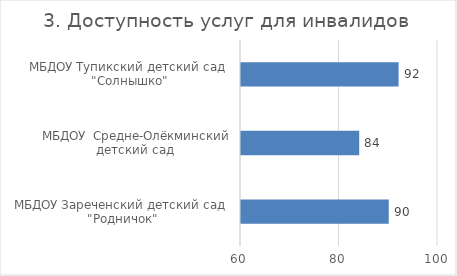
| Category | 3. Доступность услуг для инвалидов |
|---|---|
| МБДОУ Зареченский детский сад  "Родничок" | 90 |
| МБДОУ  Средне-Олёкминский детский сад  | 84 |
| МБДОУ Тупикский детский сад  "Солнышко" | 92 |